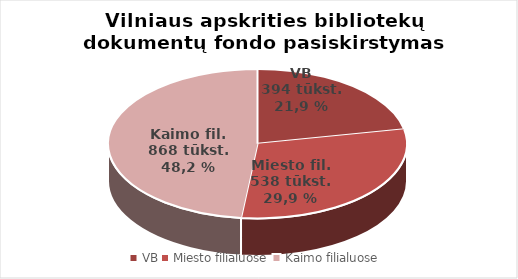
| Category | Series 0 |
|---|---|
| VB | 394047 |
| Miesto filialuose | 537691 |
| Kaimo filialuose | 868481 |